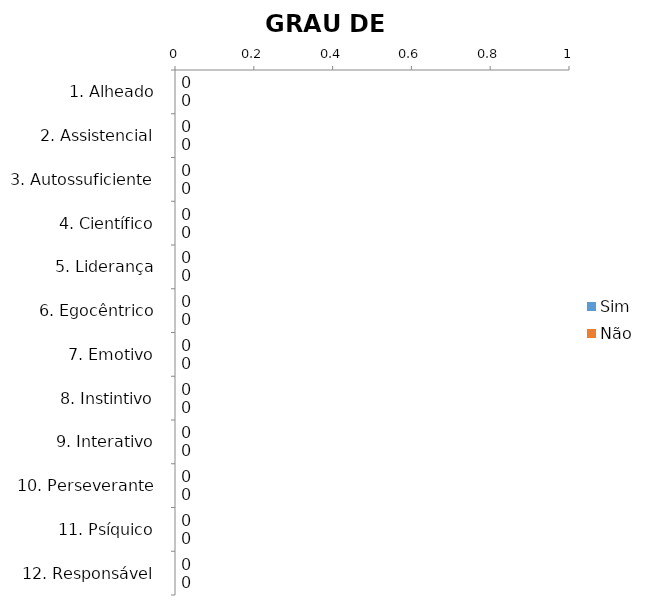
| Category | Sim | Não |
|---|---|---|
| 1. Alheado | 0 | 0 |
| 2. Assistencial | 0 | 0 |
| 3. Autossuficiente | 0 | 0 |
| 4. Científico | 0 | 0 |
| 5. Liderança | 0 | 0 |
| 6. Egocêntrico | 0 | 0 |
| 7. Emotivo | 0 | 0 |
| 8. Instintivo | 0 | 0 |
| 9. Interativo | 0 | 0 |
| 10. Perseverante | 0 | 0 |
| 11. Psíquico | 0 | 0 |
| 12. Responsável | 0 | 0 |